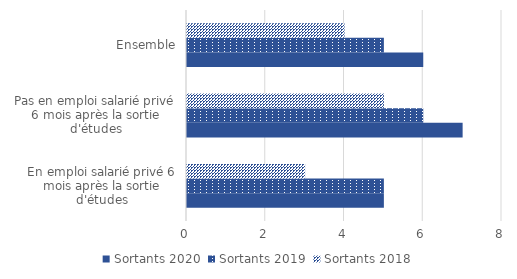
| Category | Sortants 2020 | Sortants 2019 | Sortants 2018 |
|---|---|---|---|
| En emploi salarié privé 6 mois après la sortie d'études | 5 | 5 | 3 |
| Pas en emploi salarié privé 6 mois après la sortie d'études | 7 | 6 | 5 |
| Ensemble | 6 | 5 | 4 |